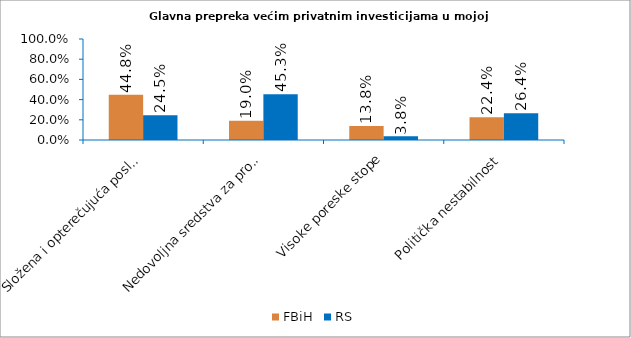
| Category | FBiH | RS |
|---|---|---|
| Složena i opterečujuća poslovna regulativa | 0.448 | 0.245 |
| Nedovoljna sredstva za promociju/podsticanje investicija | 0.19 | 0.453 |
| Visoke poreske stope | 0.138 | 0.038 |
| Politička nestabilnost | 0.224 | 0.264 |